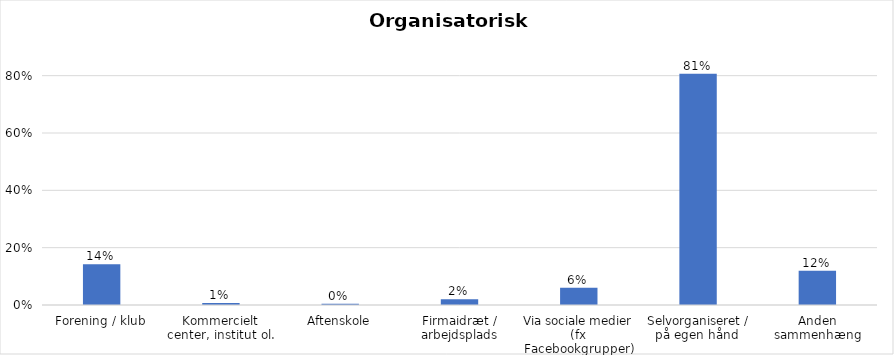
| Category | % |
|---|---|
| Forening / klub | 0.142 |
| Kommercielt center, institut ol. | 0.007 |
| Aftenskole | 0.004 |
| Firmaidræt / arbejdsplads | 0.02 |
| Via sociale medier (fx Facebookgrupper) | 0.06 |
| Selvorganiseret / på egen hånd  | 0.806 |
| Anden sammenhæng | 0.119 |